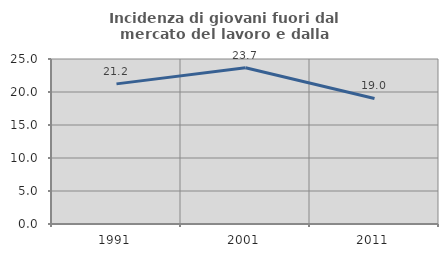
| Category | Incidenza di giovani fuori dal mercato del lavoro e dalla formazione  |
|---|---|
| 1991.0 | 21.232 |
| 2001.0 | 23.662 |
| 2011.0 | 19.023 |